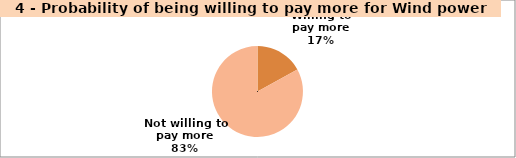
| Category | Series 0 |
|---|---|
| Willing to pay more | 0.17 |
| Not willing to pay more | 0.83 |